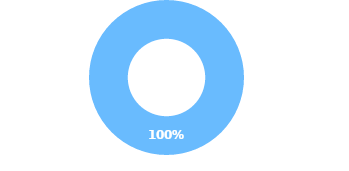
| Category | Series 0 |
|---|---|
| 0 | 0 |
| 1 | 94510 |